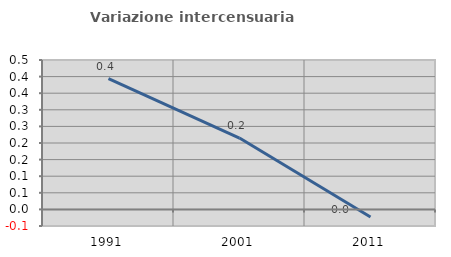
| Category | Variazione intercensuaria annua |
|---|---|
| 1991.0 | 0.394 |
| 2001.0 | 0.215 |
| 2011.0 | -0.023 |